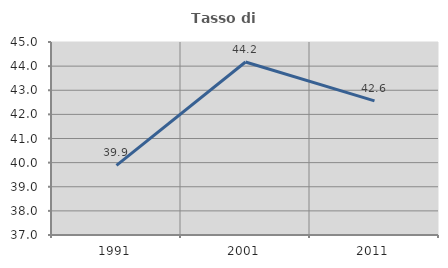
| Category | Tasso di occupazione   |
|---|---|
| 1991.0 | 39.884 |
| 2001.0 | 44.169 |
| 2011.0 | 42.559 |